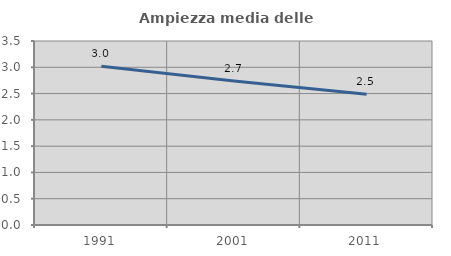
| Category | Ampiezza media delle famiglie |
|---|---|
| 1991.0 | 3.02 |
| 2001.0 | 2.74 |
| 2011.0 | 2.485 |